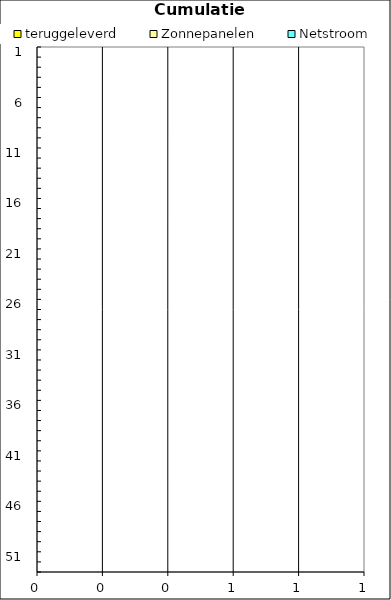
| Category | teruggeleverd | Zonnepanelen | Netstroom |
|---|---|---|---|
| 1.0 | 0 | 0 | 0 |
| 2.0 | 0 | 0 | 0 |
| 3.0 | 0 | 0 | 0 |
| 4.0 | 0 | 0 | 0 |
| 5.0 | 0 | 0 | 0 |
| 6.0 | 0 | 0 | 0 |
| 7.0 | 0 | 0 | 0 |
| 8.0 | 0 | 0 | 0 |
| 9.0 | 0 | 0 | 0 |
| 10.0 | 0 | 0 | 0 |
| 11.0 | 0 | 0 | 0 |
| 12.0 | 0 | 0 | 0 |
| 13.0 | 0 | 0 | 0 |
| 14.0 | 0 | 0 | 0 |
| 15.0 | 0 | 0 | 0 |
| 16.0 | 0 | 0 | 0 |
| 17.0 | 0 | 0 | 0 |
| 18.0 | 0 | 0 | 0 |
| 19.0 | 0 | 0 | 0 |
| 20.0 | 0 | 0 | 0 |
| 21.0 | 0 | 0 | 0 |
| 22.0 | 0 | 0 | 0 |
| 23.0 | 0 | 0 | 0 |
| 24.0 | 0 | 0 | 0 |
| 25.0 | 0 | 0 | 0 |
| 26.0 | 0 | 0 | 0 |
| 27.0 | 0 | 0 | 0 |
| 28.0 | 0 | 0 | 0 |
| 29.0 | 0 | 0 | 0 |
| 30.0 | 0 | 0 | 0 |
| 31.0 | 0 | 0 | 0 |
| 32.0 | 0 | 0 | 0 |
| 33.0 | 0 | 0 | 0 |
| 34.0 | 0 | 0 | 0 |
| 35.0 | 0 | 0 | 0 |
| 36.0 | 0 | 0 | 0 |
| 37.0 | 0 | 0 | 0 |
| 38.0 | 0 | 0 | 0 |
| 39.0 | 0 | 0 | 0 |
| 40.0 | 0 | 0 | 0 |
| 41.0 | 0 | 0 | 0 |
| 42.0 | 0 | 0 | 0 |
| 43.0 | 0 | 0 | 0 |
| 44.0 | 0 | 0 | 0 |
| 45.0 | 0 | 0 | 0 |
| 46.0 | 0 | 0 | 0 |
| 47.0 | 0 | 0 | 0 |
| 48.0 | 0 | 0 | 0 |
| 49.0 | 0 | 0 | 0 |
| 50.0 | 0 | 0 | 0 |
| 51.0 | 0 | 0 | 0 |
| 52.0 | 0 | 0 | 0 |